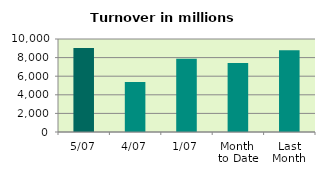
| Category | Series 0 |
|---|---|
| 5/07 | 9031.002 |
| 4/07 | 5363.734 |
| 1/07 | 7876.015 |
| Month 
to Date | 7423.584 |
| Last
Month | 8790.45 |